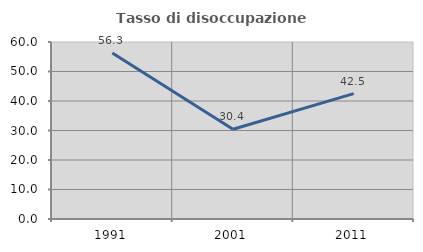
| Category | Tasso di disoccupazione giovanile  |
|---|---|
| 1991.0 | 56.296 |
| 2001.0 | 30.435 |
| 2011.0 | 42.5 |